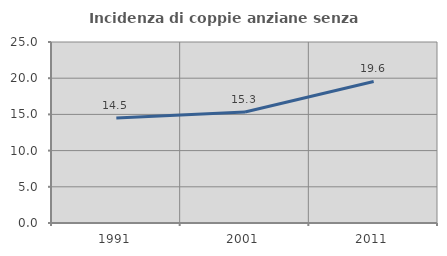
| Category | Incidenza di coppie anziane senza figli  |
|---|---|
| 1991.0 | 14.497 |
| 2001.0 | 15.337 |
| 2011.0 | 19.551 |